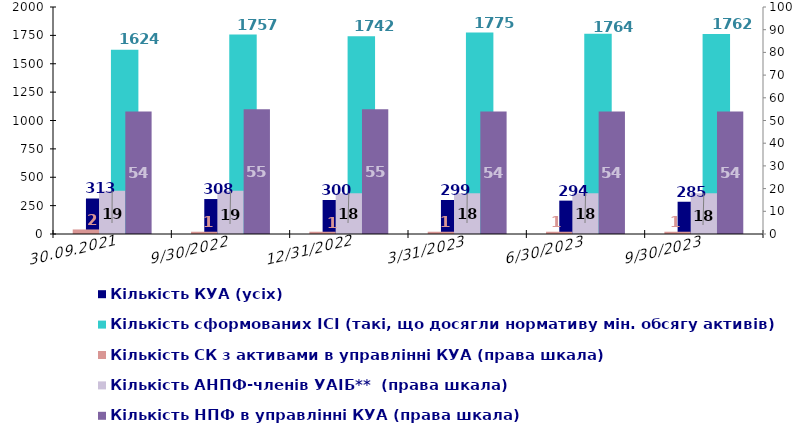
| Category | Кількість КУА (усіх) | Кількість КУА з ІСІ в управлінні | Кількість ІСІ в управлінні  | Кількість сформованих ІСІ (такі, що досягли нормативу мін. обсягу активів)  |
|---|---|---|---|---|
| 30.09.2021 | 313 |  |  | 1624 |
| 30.09.2022 | 308 |  |  | 1757 |
| 31.12.2022 | 300 |  |  | 1742 |
| 31.03.2023 | 299 |  |  | 1775 |
| 30.06.2023 | 294 |  |  | 1764 |
| 30.09.2023 | 285 |  |  | 1762 |